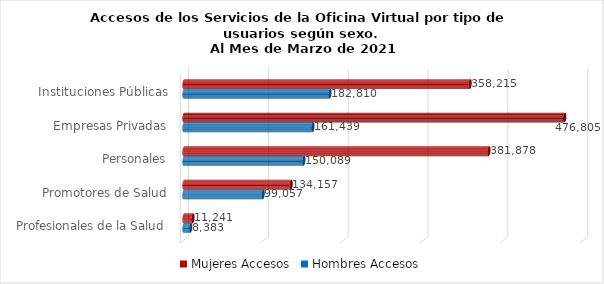
| Category | Mujeres | Hombres |
|---|---|---|
| Instituciones Públicas | 358215 | 182810 |
| Empresas Privadas | 476805 | 161439 |
| Personales | 381878 | 150089 |
| Promotores de Salud | 134157 | 99057 |
| Profesionales de la Salud | 11241 | 8383 |